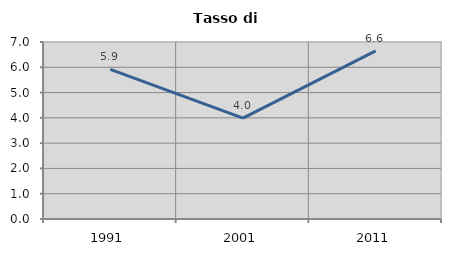
| Category | Tasso di disoccupazione   |
|---|---|
| 1991.0 | 5.918 |
| 2001.0 | 3.991 |
| 2011.0 | 6.649 |